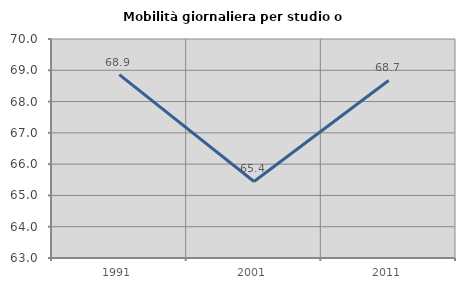
| Category | Mobilità giornaliera per studio o lavoro |
|---|---|
| 1991.0 | 68.862 |
| 2001.0 | 65.446 |
| 2011.0 | 68.675 |